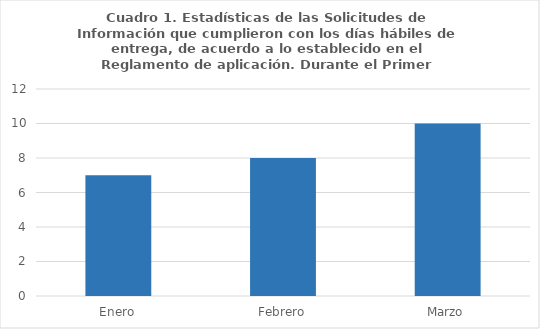
| Category | Series 0 |
|---|---|
| Enero | 7 |
| Febrero | 8 |
| Marzo | 10 |